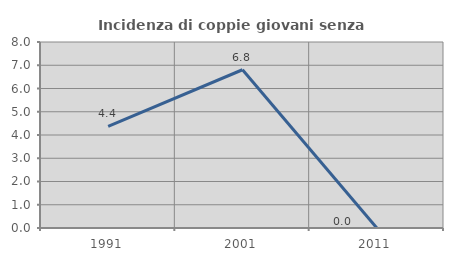
| Category | Incidenza di coppie giovani senza figli |
|---|---|
| 1991.0 | 4.372 |
| 2001.0 | 6.806 |
| 2011.0 | 0 |